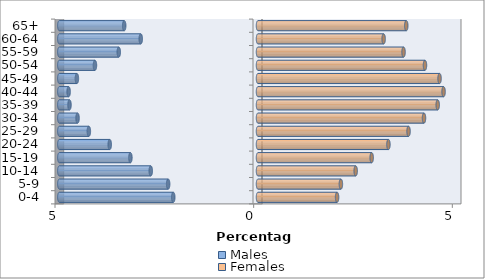
| Category | Males | Females |
|---|---|---|
| 0-4 | -2.133 | 1.99 |
| 5-9 | -2.261 | 2.086 |
| 10-14 | -2.699 | 2.459 |
| 15-19 | -3.211 | 2.861 |
| 20-24 | -3.732 | 3.283 |
| 25-29 | -4.257 | 3.789 |
| 30-34 | -4.542 | 4.178 |
| 35-39 | -4.745 | 4.523 |
| 40-44 | -4.766 | 4.671 |
| 45-49 | -4.558 | 4.569 |
| 50-54 | -4.104 | 4.202 |
| 55-59 | -3.504 | 3.663 |
| 60-64 | -2.951 | 3.162 |
| 65+ | -3.367 | 3.732 |